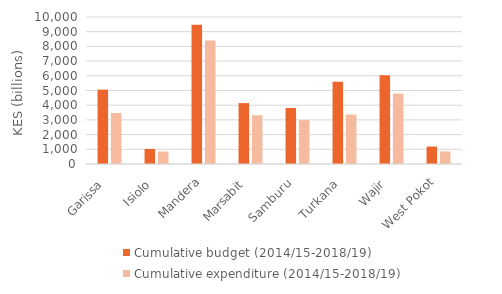
| Category | Cumulative budget (2014/15-2018/19) | Cumulative expenditure (2014/15-2018/19) |
|---|---|---|
| Garissa  | 5061.38 | 3475.58 |
| Isiolo  | 1026.47 | 847.13 |
| Mandera | 9475.11 | 8409.01 |
| Marsabit  | 4141.76 | 3314.85 |
| Samburu  | 3806.96 | 2998.39 |
| Turkana  | 5596.94 | 3360.88 |
| Wajir  | 6034.38 | 4789.64 |
| West Pokot | 1186.8 | 856.76 |